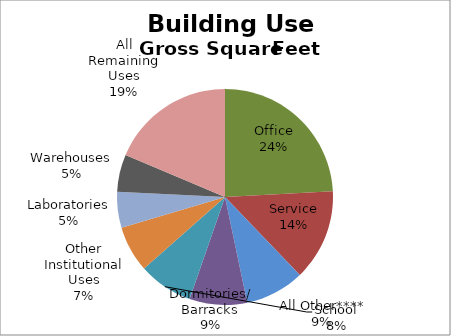
| Category | Series 0 |
|---|---|
| Office | 797587246.11 |
| Service | 451191989.798 |
| All Other**** | 293053483.186 |
| Dormitories/Barracks | 284711238.596 |
| School | 269669530.586 |
| Other Institutional Uses | 228353921.979 |
| Laboratories | 176900794.595 |
| Warehouses | 185101242.595 |
| All Remaining Uses | 615157638.974 |